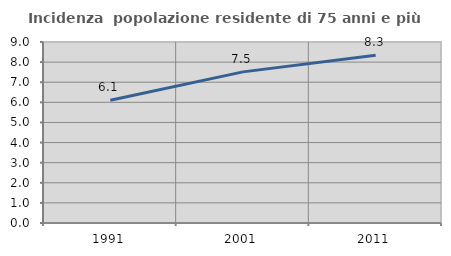
| Category | Incidenza  popolazione residente di 75 anni e più |
|---|---|
| 1991.0 | 6.1 |
| 2001.0 | 7.514 |
| 2011.0 | 8.338 |